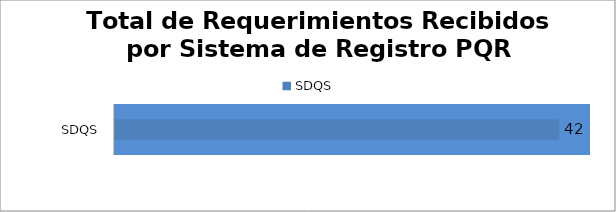
| Category | Total |
|---|---|
| SDQS | 42 |